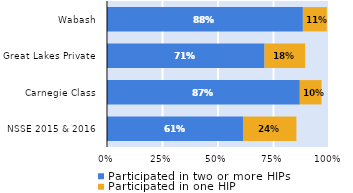
| Category | Participated in two or more HIPs | Participated in one HIP |
|---|---|---|
| NSSE 2015 & 2016 | 0.613 | 0.241 |
| Carnegie Class | 0.869 | 0.098 |
| Great Lakes Private | 0.71 | 0.183 |
| Wabash | 0.882 | 0.108 |